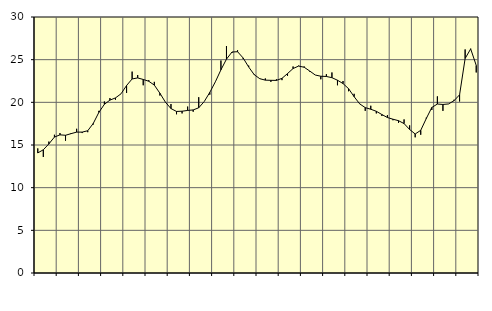
| Category | Piggar | Series 1 |
|---|---|---|
| nan | 14.6 | 14.07 |
| 1.0 | 13.6 | 14.44 |
| 1.0 | 15.4 | 15.13 |
| 1.0 | 16.2 | 15.93 |
| nan | 16.4 | 16.19 |
| 2.0 | 15.5 | 16.14 |
| 2.0 | 16.4 | 16.33 |
| 2.0 | 16.9 | 16.51 |
| nan | 16.4 | 16.51 |
| 3.0 | 16.5 | 16.67 |
| 3.0 | 17.4 | 17.53 |
| 3.0 | 19 | 18.81 |
| nan | 20.1 | 19.77 |
| 4.0 | 20.5 | 20.26 |
| 4.0 | 20.3 | 20.52 |
| 4.0 | 21 | 21 |
| nan | 21.1 | 21.97 |
| 5.0 | 23.6 | 22.74 |
| 5.0 | 23.2 | 22.86 |
| 5.0 | 22 | 22.68 |
| nan | 22.6 | 22.47 |
| 6.0 | 22.4 | 22.02 |
| 6.0 | 20.8 | 21.07 |
| 6.0 | 20 | 20.02 |
| nan | 19.8 | 19.27 |
| 7.0 | 18.6 | 18.93 |
| 7.0 | 18.7 | 18.96 |
| 7.0 | 19.5 | 19.05 |
| nan | 18.9 | 19.11 |
| 8.0 | 20.6 | 19.36 |
| 8.0 | 20.1 | 20.1 |
| 8.0 | 20.9 | 21.17 |
| nan | 22.4 | 22.41 |
| 9.0 | 24.9 | 23.81 |
| 9.0 | 26.6 | 25.06 |
| 9.0 | 25.8 | 25.9 |
| nan | 26.1 | 25.93 |
| 10.0 | 25.1 | 25.2 |
| 10.0 | 24.3 | 24.14 |
| 10.0 | 23.3 | 23.24 |
| nan | 22.8 | 22.77 |
| 11.0 | 22.8 | 22.6 |
| 11.0 | 22.4 | 22.58 |
| 11.0 | 22.7 | 22.57 |
| nan | 22.6 | 22.81 |
| 12.0 | 23.1 | 23.37 |
| 12.0 | 24.2 | 23.96 |
| 12.0 | 24.3 | 24.25 |
| nan | 24.2 | 24.11 |
| 13.0 | 23.6 | 23.67 |
| 13.0 | 23.2 | 23.2 |
| 13.0 | 22.7 | 23.06 |
| nan | 23.3 | 23.03 |
| 14.0 | 23.5 | 22.89 |
| 14.0 | 22 | 22.59 |
| 14.0 | 22.5 | 22.2 |
| nan | 21.3 | 21.6 |
| 15.0 | 21 | 20.66 |
| 15.0 | 19.8 | 19.82 |
| 15.0 | 19 | 19.38 |
| nan | 19.6 | 19.19 |
| 16.0 | 18.7 | 18.95 |
| 16.0 | 18.4 | 18.57 |
| 16.0 | 18.5 | 18.22 |
| nan | 17.9 | 18.02 |
| 17.0 | 17.6 | 17.85 |
| 17.0 | 18 | 17.51 |
| 17.0 | 17.3 | 16.82 |
| nan | 15.9 | 16.29 |
| 18.0 | 16.2 | 16.72 |
| 18.0 | 18.2 | 18.1 |
| 18.0 | 19.1 | 19.4 |
| nan | 20.7 | 19.8 |
| 19.0 | 19 | 19.75 |
| 19.0 | 19.8 | 19.81 |
| 19.0 | 20.3 | 20.19 |
| nan | 20.1 | 20.88 |
| 20.0 | 26.2 | 25.14 |
| 20.0 | 26.3 | 26.26 |
| 20.0 | 23.5 | 24.33 |